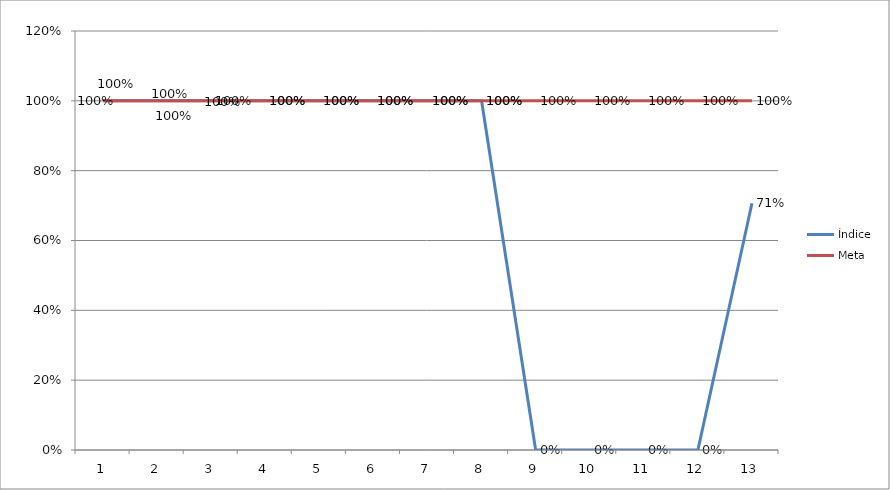
| Category | Índice | Meta |
|---|---|---|
| 0 | 1 | 1 |
| 1 | 1 | 1 |
| 2 | 1 | 1 |
| 3 | 1 | 1 |
| 4 | 1 | 1 |
| 5 | 1 | 1 |
| 6 | 1 | 1 |
| 7 | 1 | 1 |
| 8 | 0 | 1 |
| 9 | 0 | 1 |
| 10 | 0 | 1 |
| 11 | 0 | 1 |
| 12 | 0.707 | 1 |